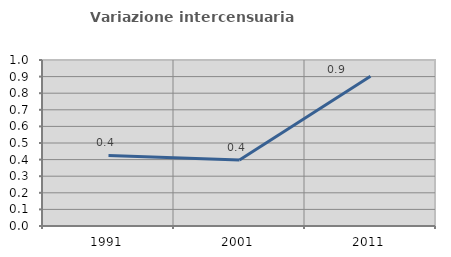
| Category | Variazione intercensuaria annua |
|---|---|
| 1991.0 | 0.425 |
| 2001.0 | 0.398 |
| 2011.0 | 0.903 |